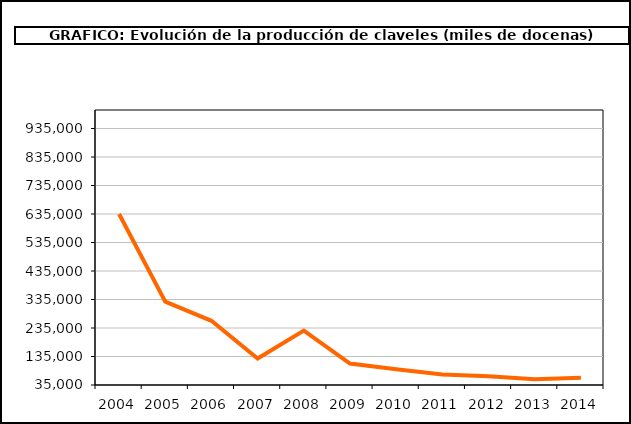
| Category | producción |
|---|---|
| 2004.0 | 634906 |
| 2005.0 | 327566 |
| 2006.0 | 260265 |
| 2007.0 | 127802 |
| 2008.0 | 226062 |
| 2009.0 | 110337 |
| 2010.0 | 90126 |
| 2011.0 | 71606 |
| 2012.0 | 65631 |
| 2013.0 | 54800 |
| 2014.0 | 60277 |